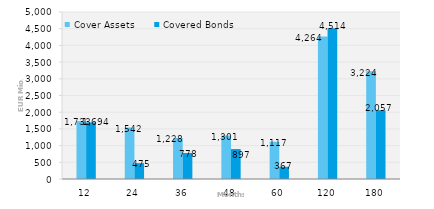
| Category | Cover Assets | Covered Bonds |
|---|---|---|
| 12.0 | 1732.556 | 1693.773 |
| 24.0 | 1541.762 | 474.613 |
| 36.0 | 1227.84 | 778.414 |
| 48.0 | 1301.064 | 896.896 |
| 60.0 | 1116.82 | 366.55 |
| 120.0 | 4263.552 | 4514.184 |
| 180.0 | 3223.683 | 2057.397 |